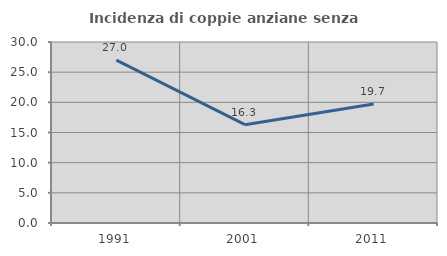
| Category | Incidenza di coppie anziane senza figli  |
|---|---|
| 1991.0 | 27.007 |
| 2001.0 | 16.296 |
| 2011.0 | 19.718 |